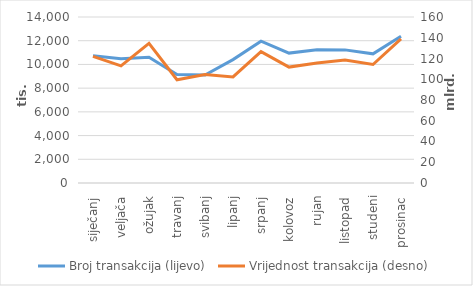
| Category | Broj transakcija (lijevo) |
|---|---|
| siječanj | 10731340 |
| veljača | 10481066 |
| ožujak | 10610362 |
| travanj | 9158467 |
| svibanj | 9103422 |
| lipanj | 10405835 |
| srpanj | 11963694 |
| kolovoz | 10955668 |
| rujan | 11234037 |
| listopad | 11226257 |
| studeni | 10891873 |
| prosinac | 12377027 |